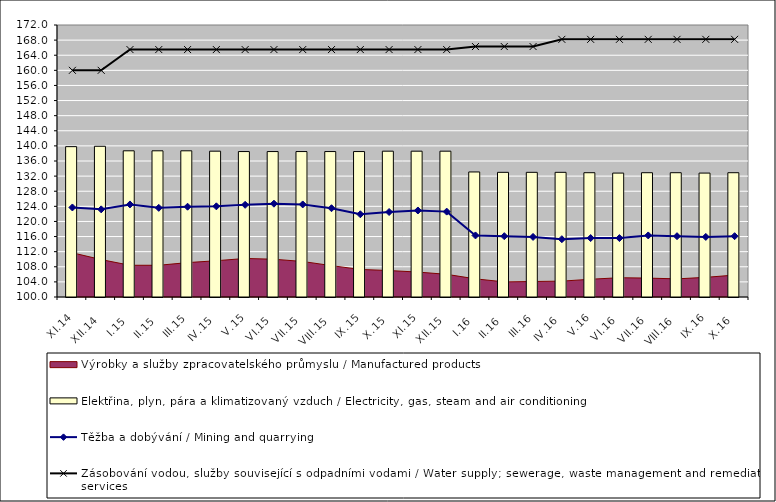
| Category | Elektřina, plyn, pára a klimatizovaný vzduch / Electricity, gas, steam and air conditioning |
|---|---|
| XI.14 | 139.8 |
| XII.14 | 139.9 |
| I.15 | 138.7 |
| II.15 | 138.7 |
| III.15 | 138.7 |
| IV.15 | 138.6 |
| V.15 | 138.5 |
| VI.15 | 138.5 |
| VII.15 | 138.5 |
| VIII.15 | 138.5 |
| IX.15 | 138.5 |
| X.15 | 138.6 |
| XI.15 | 138.6 |
| XII.15 | 138.6 |
| I.16 | 133.1 |
| II.16 | 133 |
| III.16 | 133 |
| IV.16 | 133 |
| V.16 | 132.9 |
| VI.16 | 132.8 |
| VII.16 | 132.9 |
| VIII.16 | 132.9 |
| IX.16 | 132.8 |
| X.16 | 132.9 |